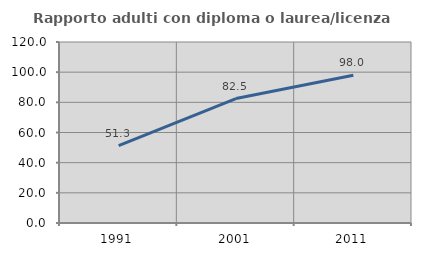
| Category | Rapporto adulti con diploma o laurea/licenza media  |
|---|---|
| 1991.0 | 51.304 |
| 2001.0 | 82.529 |
| 2011.0 | 97.976 |